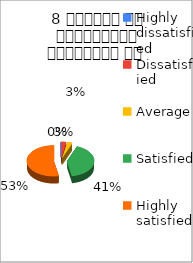
| Category | 8 शिक्षक का सम्प्रेषण सुस्पष्ठ है  |
|---|---|
| Highly dissatisfied | 0 |
| Dissatisfied | 1 |
| Average | 1 |
| Satisfied | 14 |
| Highly satisfied | 18 |